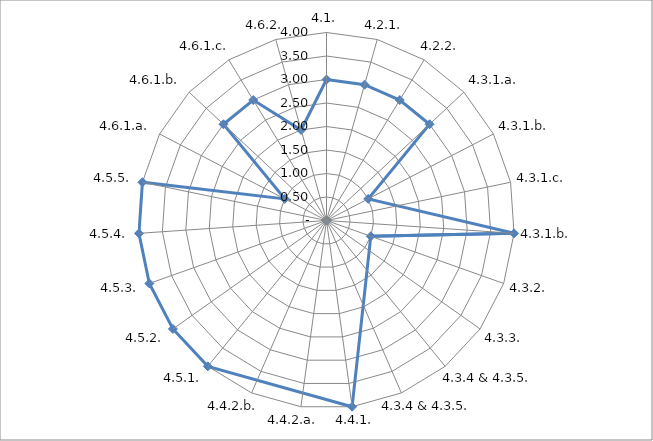
| Category | Series 0 |
|---|---|
| 4.1. | 3 |
| 4.2.1. | 3 |
| 4.2.2. | 3 |
| 4.3.1.a. | 3 |
| 4.3.1.b. | 1 |
| 4.3.1.c. | 0 |
| 4.3.1.b. | 4 |
| 4.3.2. | 1 |
| 4.3.3. | 0 |
| 4.3.4 & 4.3.5. | 0 |
| 4.3.4 & 4.3.5. | 0 |
| 4.4.1. | 4 |
| 4.4.2.a. | 0 |
| 4.4.2.b. | 0 |
| 4.5.1. | 4 |
| 4.5.2. | 4 |
| 4.5.3. | 4 |
| 4.5.4. | 4 |
| 4.5.5. | 4 |
| 4.6.1.a. | 1 |
| 4.6.1.b. | 3 |
| 4.6.1.c. | 3 |
| 4.6.2. | 2 |